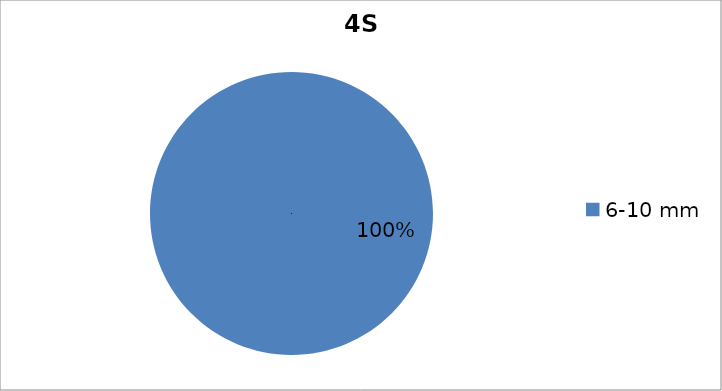
| Category | Series 0 |
|---|---|
| 6-10 mm  | 1 |